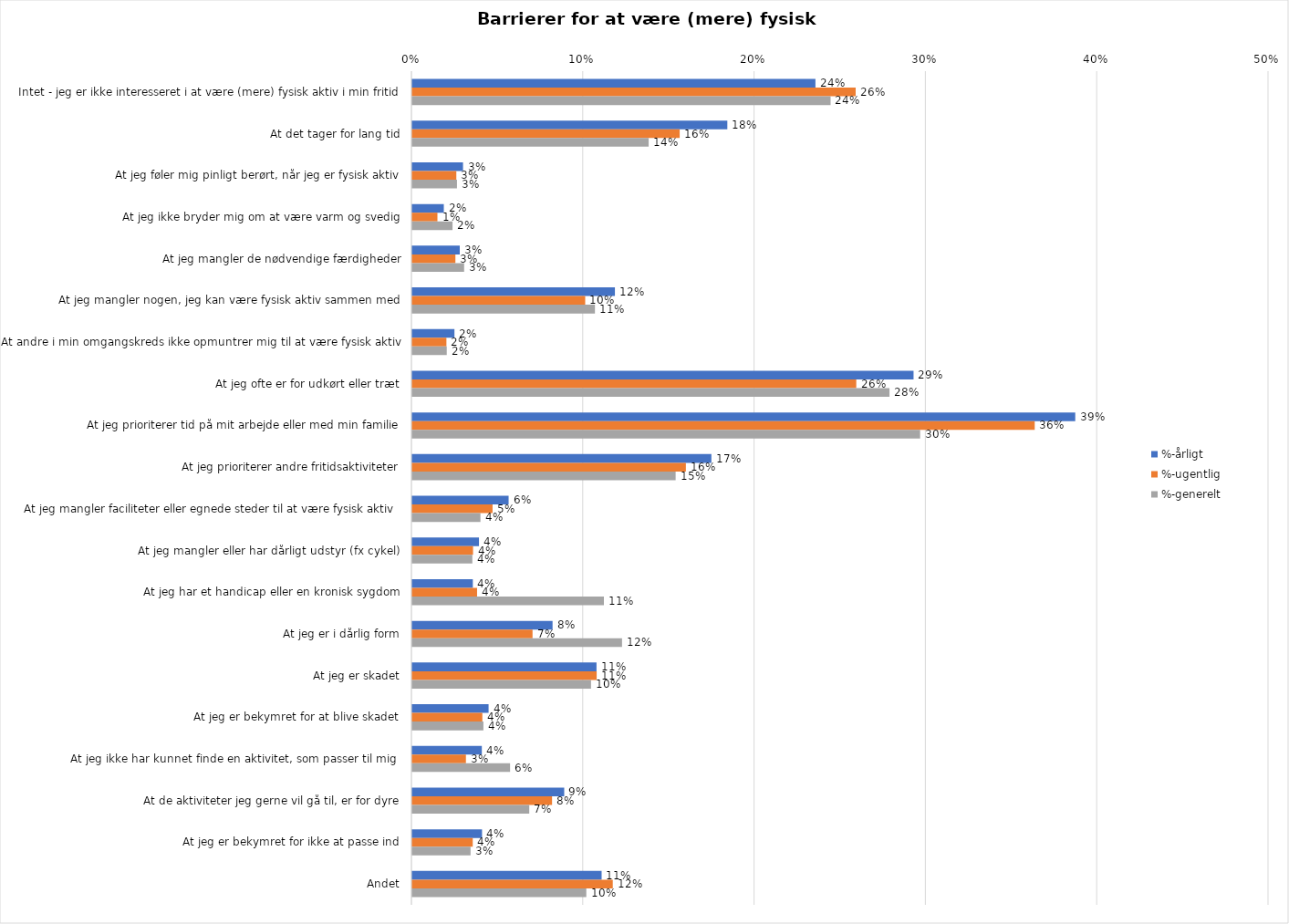
| Category | %-årligt | %-ugentlig | %-generelt |
|---|---|---|---|
| Intet - jeg er ikke interesseret i at være (mere) fysisk aktiv i min fritid | 0.235 | 0.259 | 0.244 |
| At det tager for lang tid | 0.184 | 0.156 | 0.138 |
| At jeg føler mig pinligt berørt, når jeg er fysisk aktiv | 0.03 | 0.026 | 0.026 |
| At jeg ikke bryder mig om at være varm og svedig | 0.018 | 0.015 | 0.023 |
| At jeg mangler de nødvendige færdigheder | 0.028 | 0.025 | 0.03 |
| At jeg mangler nogen, jeg kan være fysisk aktiv sammen med | 0.118 | 0.101 | 0.107 |
| At andre i min omgangskreds ikke opmuntrer mig til at være fysisk aktiv | 0.025 | 0.02 | 0.02 |
| At jeg ofte er for udkørt eller træt | 0.293 | 0.259 | 0.279 |
| At jeg prioriterer tid på mit arbejde eller med min familie | 0.387 | 0.363 | 0.296 |
| At jeg prioriterer andre fritidsaktiviteter | 0.175 | 0.16 | 0.154 |
| At jeg mangler faciliteter eller egnede steder til at være fysisk aktiv  | 0.056 | 0.047 | 0.04 |
| At jeg mangler eller har dårligt udstyr (fx cykel) | 0.039 | 0.035 | 0.035 |
| At jeg har et handicap eller en kronisk sygdom | 0.035 | 0.038 | 0.112 |
| At jeg er i dårlig form | 0.082 | 0.07 | 0.122 |
| At jeg er skadet | 0.108 | 0.108 | 0.104 |
| At jeg er bekymret for at blive skadet | 0.045 | 0.041 | 0.041 |
| At jeg ikke har kunnet finde en aktivitet, som passer til mig  | 0.041 | 0.031 | 0.057 |
| At de aktiviteter jeg gerne vil gå til, er for dyre | 0.089 | 0.082 | 0.068 |
| At jeg er bekymret for ikke at passe ind | 0.041 | 0.035 | 0.034 |
| Andet | 0.11 | 0.117 | 0.102 |